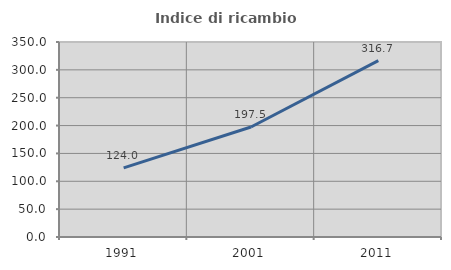
| Category | Indice di ricambio occupazionale  |
|---|---|
| 1991.0 | 124 |
| 2001.0 | 197.5 |
| 2011.0 | 316.667 |